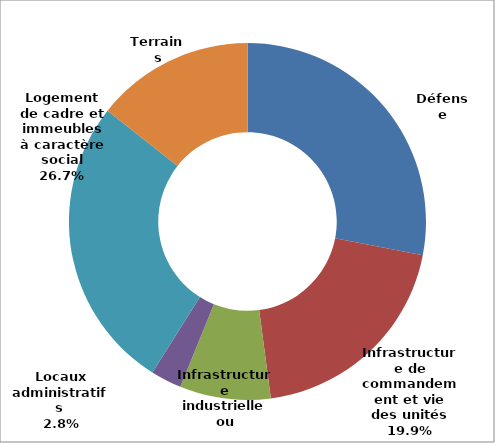
| Category | Series 0 |
|---|---|
| Défense | 940 |
| Infrastructure de commandement et vie des unités | 667 |
| Infrastructure industrielle ou logistique  | 276 |
| Locaux administratifs  | 94 |
| Logement de cadre et immeubles à caractère social | 896 |
| Terrains | 481 |